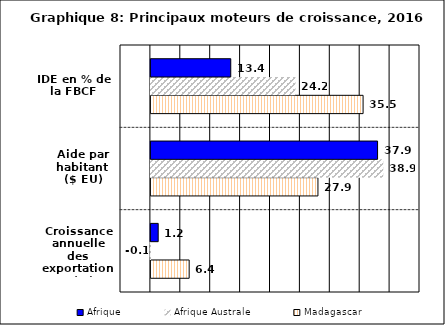
| Category | Madagascar | Afrique Australe | Afrique |
|---|---|---|---|
| Croissance annuelle des exportations (%) | 6.399 | -0.056 | 1.219 |
| Aide par habitant ($ EU) | 27.933 | 38.854 | 37.904 |
| IDE en % de la FBCF | 35.484 | 24.179 | 13.354 |